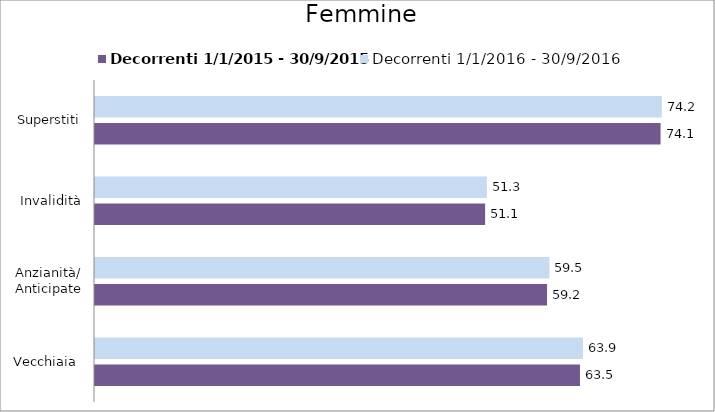
| Category | Decorrenti 1/1/2015 - 30/9/2015 | Decorrenti 1/1/2016 - 30/9/2016 |
|---|---|---|
| Vecchiaia  | 63.5 | 63.9 |
| Anzianità/ Anticipate | 59.19 | 59.5 |
| Invalidità | 51.08 | 51.31 |
| Superstiti | 74.05 | 74.21 |